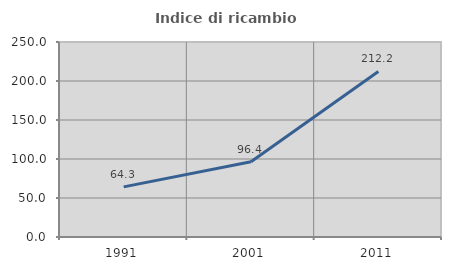
| Category | Indice di ricambio occupazionale  |
|---|---|
| 1991.0 | 64.286 |
| 2001.0 | 96.386 |
| 2011.0 | 212.222 |